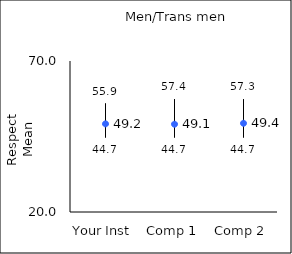
| Category | 25th percentile | 75th percentile | Mean |
|---|---|---|---|
| Your Inst | 44.7 | 55.9 | 49.19 |
| Comp 1 | 44.7 | 57.4 | 49.07 |
| Comp 2 | 44.7 | 57.3 | 49.38 |